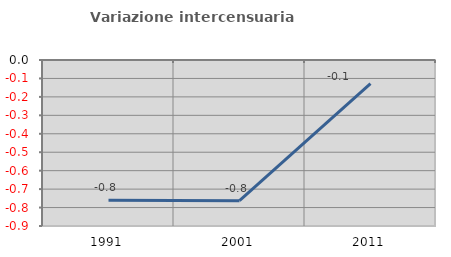
| Category | Variazione intercensuaria annua |
|---|---|
| 1991.0 | -0.76 |
| 2001.0 | -0.763 |
| 2011.0 | -0.128 |